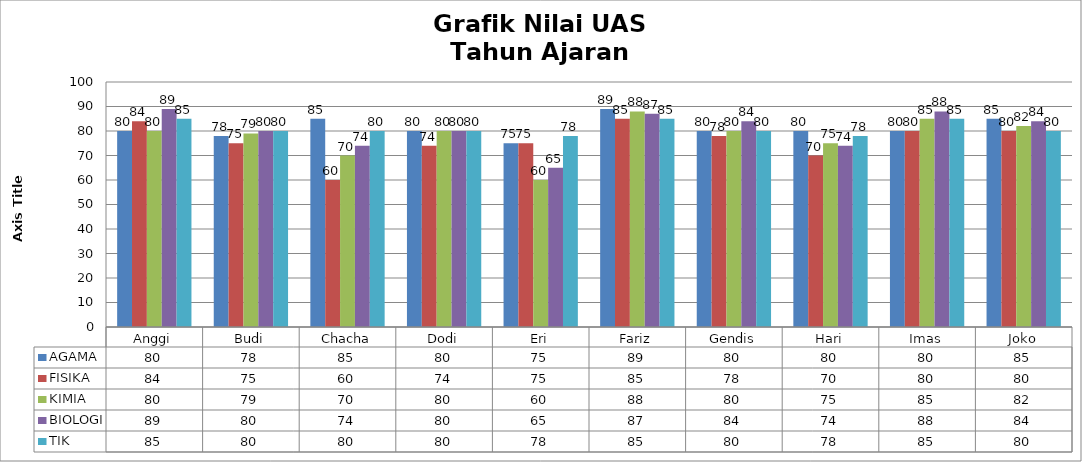
| Category | AGAMA | FISIKA | KIMIA | BIOLOGI | TIK |
|---|---|---|---|---|---|
| Anggi | 80 | 84 | 80 | 89 | 85 |
| Budi | 78 | 75 | 79 | 80 | 80 |
| Chacha | 85 | 60 | 70 | 74 | 80 |
| Dodi | 80 | 74 | 80 | 80 | 80 |
| Eri | 75 | 75 | 60 | 65 | 78 |
| Fariz | 89 | 85 | 88 | 87 | 85 |
| Gendis | 80 | 78 | 80 | 84 | 80 |
| Hari | 80 | 70 | 75 | 74 | 78 |
| Imas | 80 | 80 | 85 | 88 | 85 |
| Joko | 85 | 80 | 82 | 84 | 80 |